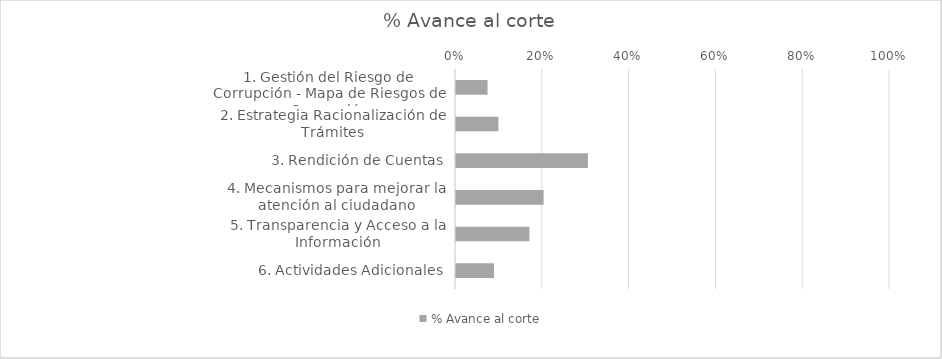
| Category | % Avance al corte |
|---|---|
| 1. Gestión del Riesgo de Corrupción - Mapa de Riesgos de Corrupción | 0.075 |
| 2. Estrategia Racionalización de Trámites | 0.1 |
| 3. Rendición de Cuentas | 0.306 |
| 4. Mecanismos para mejorar la atención al ciudadano | 0.204 |
| 5. Transparencia y Acceso a la Información | 0.171 |
| 6. Actividades Adicionales | 0.09 |